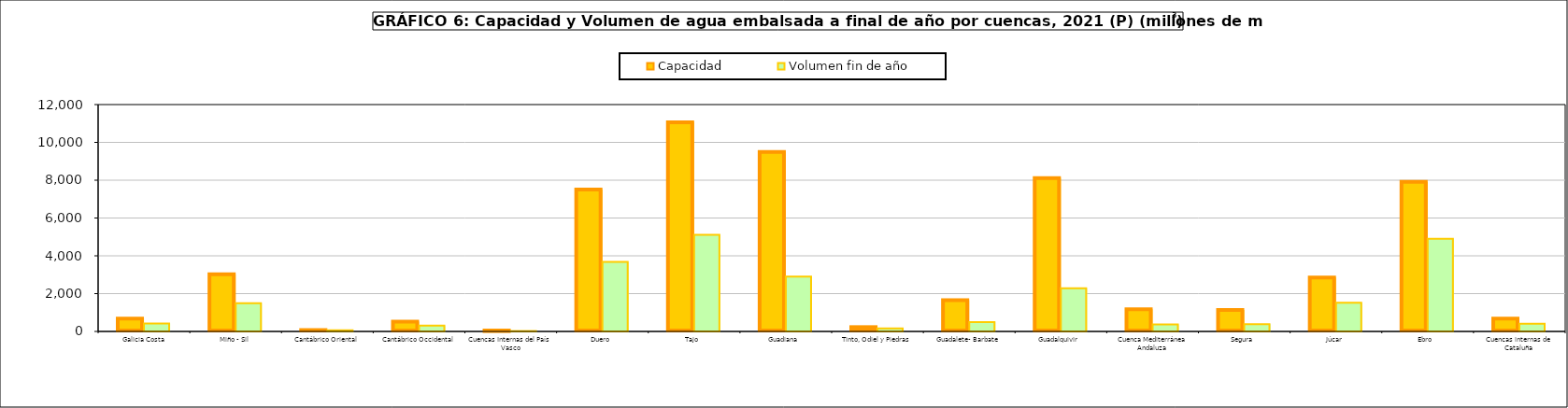
| Category | Capacidad | Volumen fin de año |
|---|---|---|
| Galicia Costa | 684 | 425 |
| Miño - Sil | 3030 | 1492 |
| Cantábrico Oriental | 73 | 62 |
| Cantábrico Occidental | 518 | 314 |
| Cuencas Internas del País Vasco | 21 | 21 |
| Duero  | 7507 | 3684 |
| Tajo  | 11056 | 5105 |
| Guadiana  | 9498 | 2906 |
| Tinto, Odiel y Piedras | 229 | 165 |
| Guadalete- Barbate | 1651 | 500 |
| Guadalquivir  | 8113 | 2290 |
| Cuenca Mediterránea Andaluza | 1174 | 374 |
| Segura  | 1140 | 385 |
| Júcar  | 2846 | 1515 |
| Ebro  | 7919 | 4896 |
| Cuencas internas de Cataluña | 677 | 411 |